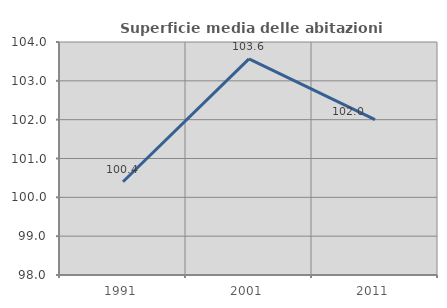
| Category | Superficie media delle abitazioni occupate |
|---|---|
| 1991.0 | 100.401 |
| 2001.0 | 103.565 |
| 2011.0 | 102.002 |